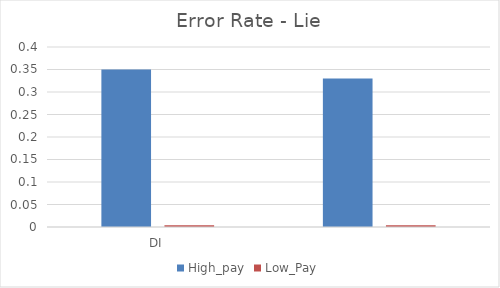
| Category | High_pay | Low_Pay |
|---|---|---|
| DI | 0.35 | 0.004 |